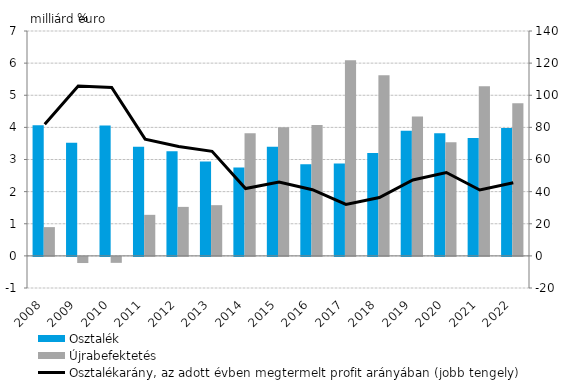
| Category | Osztalék | Újrabefektetés |
|---|---|---|
| 2008.0 | 4.064 | 0.895 |
| 2009.0 | 3.522 | -0.192 |
| 2010.0 | 4.061 | -0.186 |
| 2011.0 | 3.399 | 1.278 |
| 2012.0 | 3.253 | 1.525 |
| 2013.0 | 2.94 | 1.578 |
| 2014.0 | 2.751 | 3.816 |
| 2015.0 | 3.396 | 4.002 |
| 2016.0 | 2.853 | 4.073 |
| 2017.0 | 2.872 | 6.088 |
| 2018.0 | 3.204 | 5.621 |
| 2019.0 | 3.893 | 4.342 |
| 2020.0 | 3.815 | 3.536 |
| 2021.0 | 3.67 | 5.277 |
| 2022.0 | 3.979 | 4.753 |